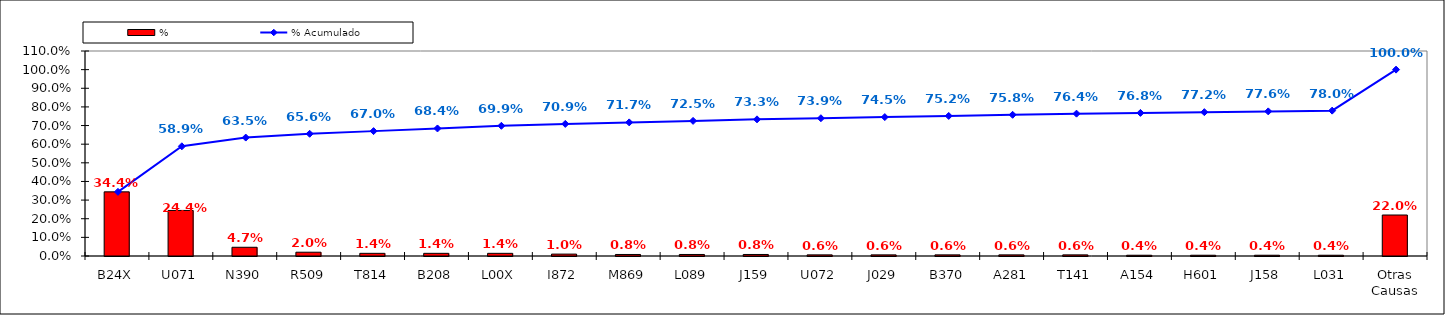
| Category | % |
|---|---|
| B24X | 0.344 |
| U071 | 0.244 |
| N390 | 0.047 |
| R509 | 0.02 |
| T814 | 0.014 |
| B208 | 0.014 |
| L00X | 0.014 |
| I872 | 0.01 |
| M869 | 0.008 |
| L089 | 0.008 |
| J159 | 0.008 |
| U072 | 0.006 |
| J029 | 0.006 |
| B370 | 0.006 |
| A281 | 0.006 |
| T141 | 0.006 |
| A154 | 0.004 |
| H601 | 0.004 |
| J158 | 0.004 |
| L031 | 0.004 |
| Otras Causas | 0.22 |